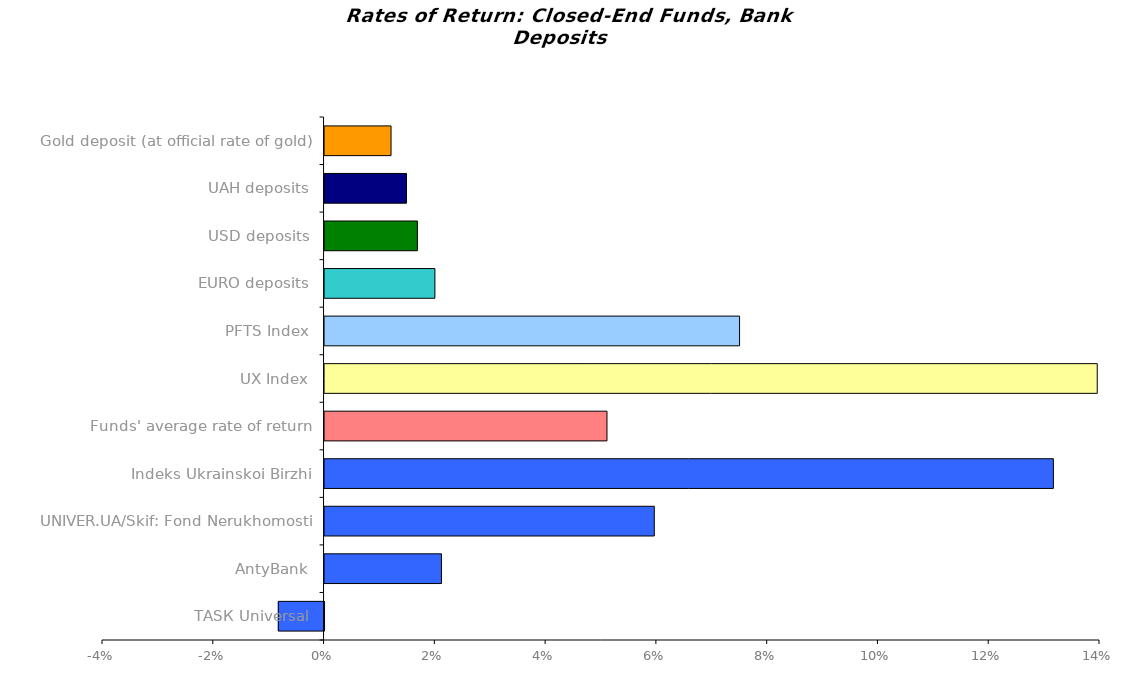
| Category | Series 0 |
|---|---|
| ТАSК Universal | -0.008 |
| AntyBank | 0.021 |
| UNIVER.UA/Skif: Fond Nerukhomosti | 0.06 |
| Indeks Ukrainskoi Birzhi | 0.132 |
| Funds' average rate of return | 0.051 |
| UX Index | 0.14 |
| PFTS Index | 0.075 |
| EURO deposits | 0.02 |
| USD deposits | 0.017 |
| UAH deposits | 0.015 |
| Gold deposit (at official rate of gold) | 0.012 |